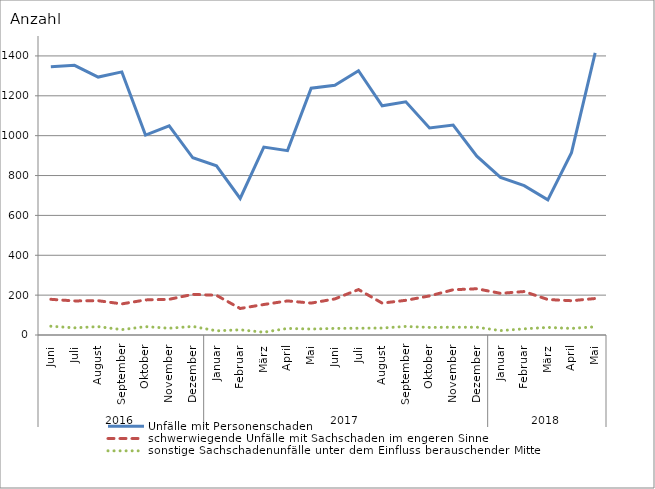
| Category | Unfälle mit Personenschaden | schwerwiegende Unfälle mit Sachschaden im engeren Sinne | sonstige Sachschadenunfälle unter dem Einfluss berauschender Mittel |
|---|---|---|---|
| 0 | 1346 | 179 | 44 |
| 1 | 1353 | 171 | 36 |
| 2 | 1294 | 172 | 42 |
| 3 | 1320 | 156 | 27 |
| 4 | 1003 | 176 | 42 |
| 5 | 1049 | 179 | 34 |
| 6 | 889 | 204 | 43 |
| 7 | 849 | 199 | 21 |
| 8 | 685 | 133 | 26 |
| 9 | 943 | 153 | 14 |
| 10 | 925 | 171 | 33 |
| 11 | 1238 | 160 | 30 |
| 12 | 1253 | 181 | 33 |
| 13 | 1326 | 228 | 34 |
| 14 | 1150 | 160 | 35 |
| 15 | 1170 | 174 | 43 |
| 16 | 1039 | 196 | 38 |
| 17 | 1053 | 227 | 39 |
| 18 | 897 | 232 | 39 |
| 19 | 791 | 209 | 22 |
| 20 | 749 | 218 | 31 |
| 21 | 678 | 178 | 38 |
| 22 | 915 | 172 | 33 |
| 23 | 1415 | 183 | 41 |